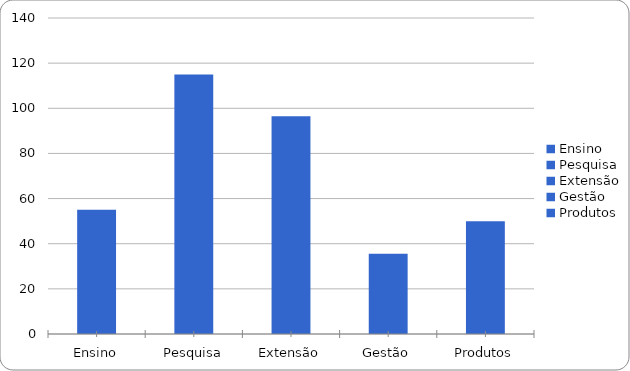
| Category | Series 0 |
|---|---|
| Ensino | 55 |
| Pesquisa | 115 |
| Extensão | 96.5 |
| Gestão | 35.5 |
| Produtos | 50 |